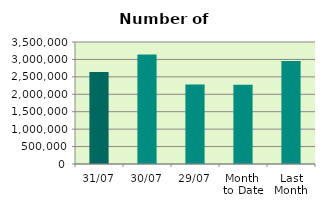
| Category | Series 0 |
|---|---|
| 31/07 | 2642678 |
| 30/07 | 3143250 |
| 29/07 | 2277584 |
| Month 
to Date | 2275631.565 |
| Last
Month | 2956123.091 |